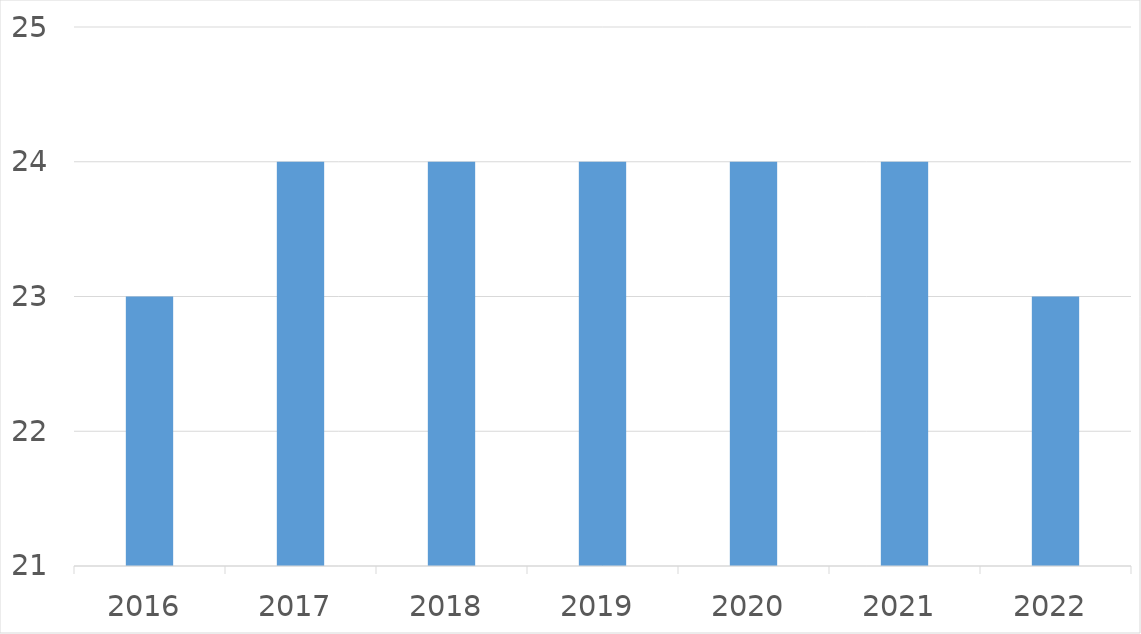
| Category | Series 0 |
|---|---|
| 2016 | 23 |
| 2017 | 24 |
| 2018 | 24 |
| 2019 | 24 |
| 2020 | 24 |
| 2021 | 24 |
| 2022 | 23 |